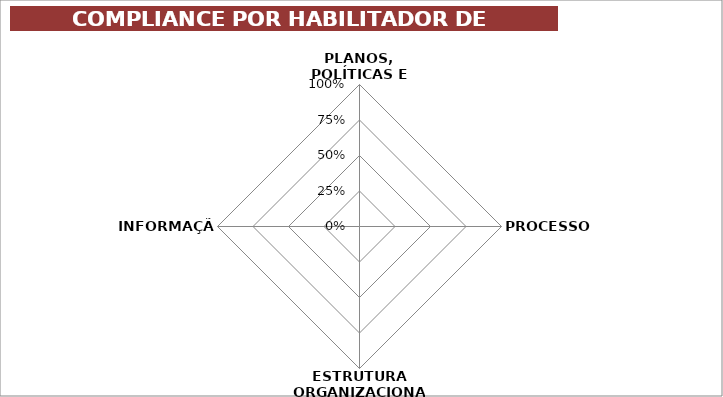
| Category | Series 0 |
|---|---|
| PLANOS, POLÍTICAS E MODELOS | 0 |
| PROCESSOS | 0 |
| ESTRUTURA ORGANIZACIONAL | 0 |
| INFORMAÇÃO | 0 |